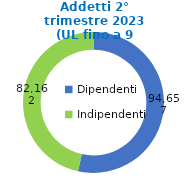
| Category | Series 0 |
|---|---|
| Dipendenti | 94657 |
| Indipendenti | 82162 |